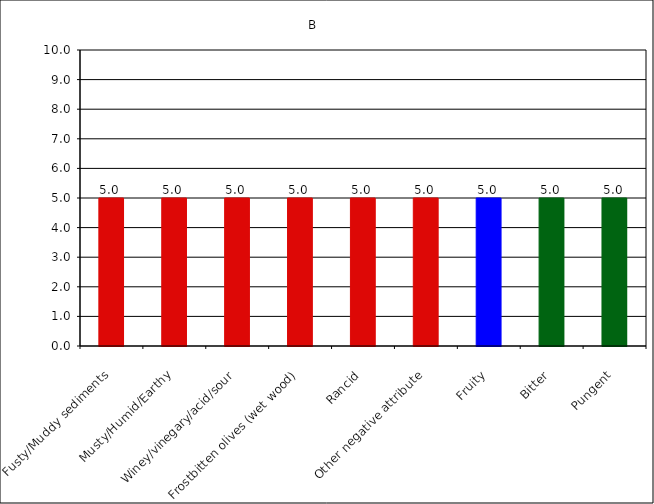
| Category | B |
|---|---|
| Fusty/Muddy sediments | 5 |
| Musty/Humid/Earthy | 5 |
| Winey/vinegary/acid/sour | 5 |
| Frostbitten olives (wet wood) | 5 |
| Rancid | 5 |
| Other negative attribute | 5 |
| Fruity | 5 |
| Bitter | 5 |
| Pungent | 5 |